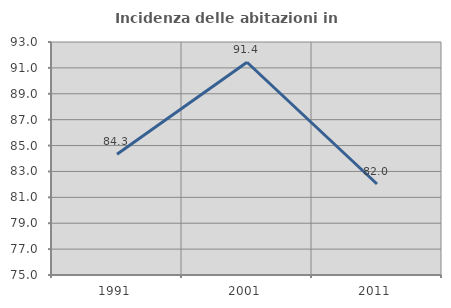
| Category | Incidenza delle abitazioni in proprietà  |
|---|---|
| 1991.0 | 84.334 |
| 2001.0 | 91.435 |
| 2011.0 | 82.03 |